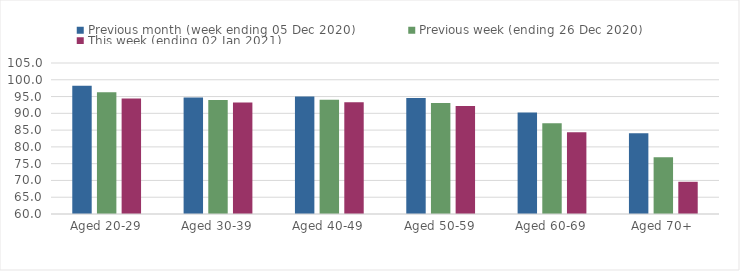
| Category | Previous month (week ending 05 Dec 2020) | Previous week (ending 26 Dec 2020) | This week (ending 02 Jan 2021) |
|---|---|---|---|
| Aged 20-29 | 98.22 | 96.3 | 94.39 |
| Aged 30-39 | 94.73 | 93.98 | 93.24 |
| Aged 40-49 | 95.01 | 94.04 | 93.32 |
| Aged 50-59 | 94.54 | 93.07 | 92.18 |
| Aged 60-69 | 90.24 | 87.05 | 84.34 |
| Aged 70+ | 84.05 | 76.88 | 69.6 |